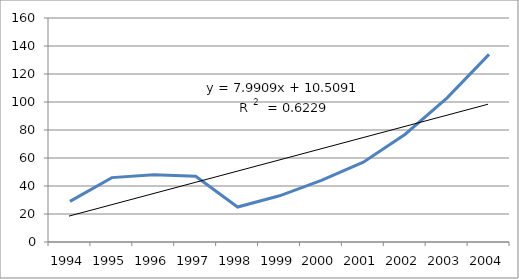
| Category | Series 0 |
|---|---|
| 1994 | 29 |
| 1995 | 46 |
| 1996 | 48 |
| 1997 | 47 |
| 1998 | 25 |
| 1999 | 33 |
| 2000 | 44 |
| 2001 | 57 |
| 2002 | 77 |
| 2003 | 103 |
| 2004 | 134 |